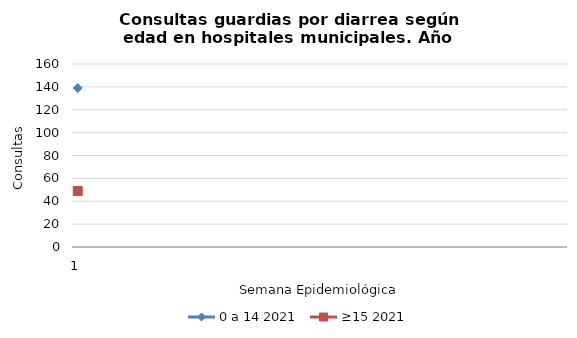
| Category | 0 a 14 2021 | ≥15 2021 |
|---|---|---|
| 1.0 | 139 | 49 |